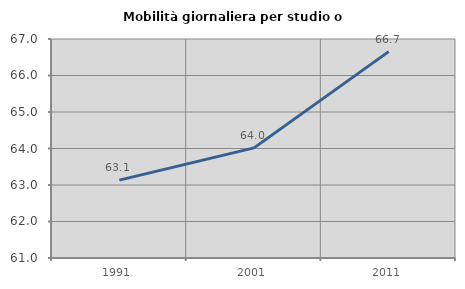
| Category | Mobilità giornaliera per studio o lavoro |
|---|---|
| 1991.0 | 63.134 |
| 2001.0 | 64.017 |
| 2011.0 | 66.654 |